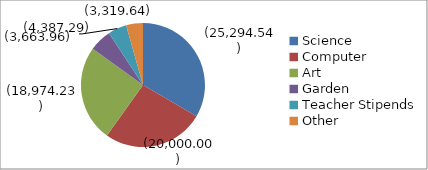
| Category | Series 0 |
|---|---|
| Science | -25294.54 |
| Computer | -20000 |
| Art | -18974.23 |
| Garden | -4387.29 |
| Teacher Stipends | -3663.96 |
| Other | -3319.64 |